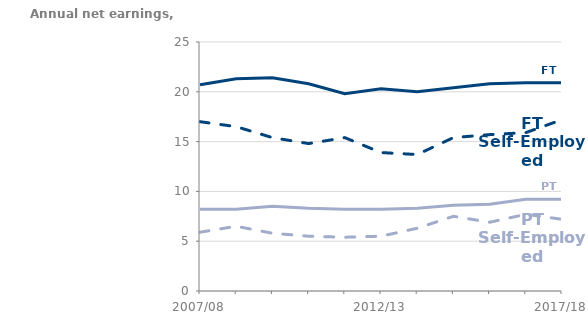
| Category | Full-Time Employees | Part-Time Self-employed | Full-Time Self-Employed | Part-Time Employees |
|---|---|---|---|---|
| 2007/08 | 20700 | 5900 | 17000 | 8200 |
| 2008/09 | 21300 | 6500 | 16500 | 8200 |
| 2009/10 | 21400 | 5800 | 15400 | 8500 |
| 2010/11 | 20800 | 5500 | 14800 | 8300 |
| 2011/12 | 19800 | 5400 | 15400 | 8200 |
| 2012/13 | 20300 | 5500 | 13900 | 8200 |
| 2013/14 | 20000 | 6300 | 13700 | 8300 |
| 2014/15 | 20400 | 7500 | 15400 | 8600 |
| 2015/16 | 20800 | 6900 | 15700 | 8700 |
| 2016/17 | 20900 | 7700 | 15900 | 9200 |
| 2017/18 | 20900 | 7200 | 17200 | 9200 |